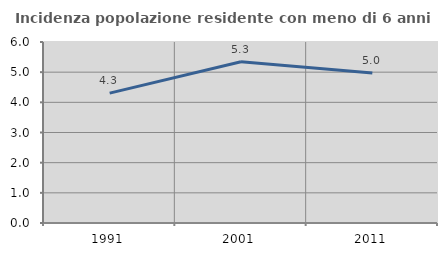
| Category | Incidenza popolazione residente con meno di 6 anni |
|---|---|
| 1991.0 | 4.306 |
| 2001.0 | 5.344 |
| 2011.0 | 4.969 |